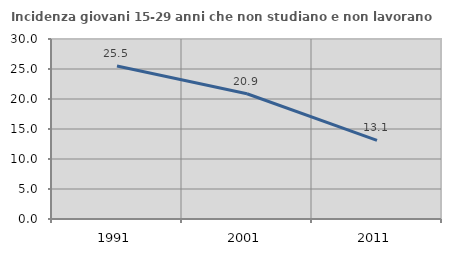
| Category | Incidenza giovani 15-29 anni che non studiano e non lavorano  |
|---|---|
| 1991.0 | 25.503 |
| 2001.0 | 20.87 |
| 2011.0 | 13.095 |